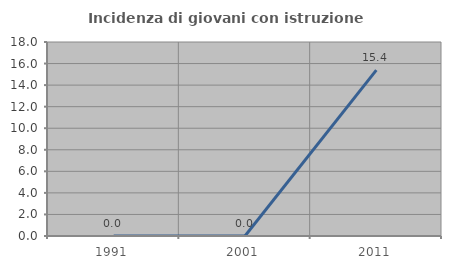
| Category | Incidenza di giovani con istruzione universitaria |
|---|---|
| 1991.0 | 0 |
| 2001.0 | 0 |
| 2011.0 | 15.385 |